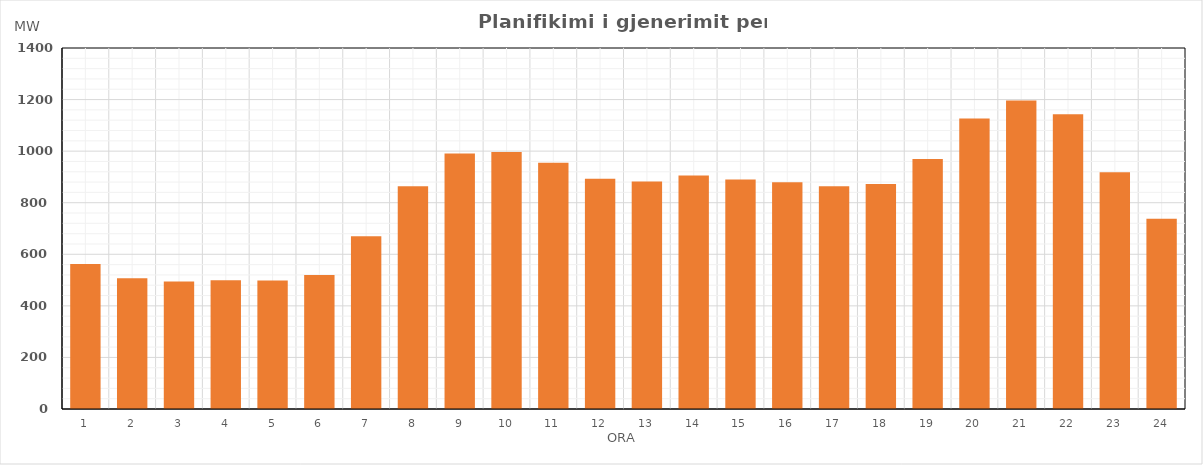
| Category | Max (MW) |
|---|---|
| 0 | 562.28 |
| 1 | 507.03 |
| 2 | 494.64 |
| 3 | 499.26 |
| 4 | 498.53 |
| 5 | 519.65 |
| 6 | 669.9 |
| 7 | 863.91 |
| 8 | 991.02 |
| 9 | 996.42 |
| 10 | 954.66 |
| 11 | 893.34 |
| 12 | 882.12 |
| 13 | 905.79 |
| 14 | 889.58 |
| 15 | 879.65 |
| 16 | 864.14 |
| 17 | 872.15 |
| 18 | 969.54 |
| 19 | 1126.49 |
| 20 | 1196.56 |
| 21 | 1143 |
| 22 | 917.67 |
| 23 | 738.15 |